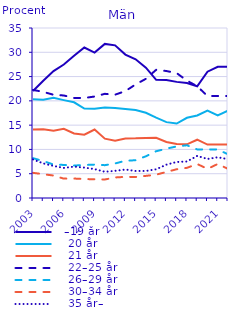
| Category |   –19 år |    20 år |    21 år |    22–25 år |    26–29 år |    30–34 år |    35 år– |
|---|---|---|---|---|---|---|---|
| 2003.0 | 22.016 | 20.329 | 14.081 | 22.251 | 8.204 | 5.182 | 7.938 |
| 2004.0 | 24.146 | 20.249 | 14.135 | 21.848 | 7.601 | 4.9 | 7.12 |
| 2005.0 | 26.123 | 20.637 | 13.871 | 21.254 | 6.89 | 4.622 | 6.603 |
| 2006.0 | 27.487 | 20.155 | 14.257 | 21.108 | 6.808 | 3.989 | 6.196 |
| 2007.0 | 29.271 | 19.701 | 13.29 | 20.589 | 6.682 | 4.005 | 6.461 |
| 2008.0 | 30.982 | 18.422 | 13.04 | 20.595 | 6.791 | 3.911 | 6.259 |
| 2009.0 | 29.947 | 18.381 | 14.103 | 20.89 | 6.876 | 3.852 | 5.952 |
| 2010.0 | 31.726 | 18.636 | 12.214 | 21.446 | 6.76 | 3.809 | 5.409 |
| 2011.0 | 31.432 | 18.554 | 11.805 | 21.276 | 7.117 | 4.227 | 5.59 |
| 2012.0 | 29.532 | 18.323 | 12.264 | 22.006 | 7.656 | 4.356 | 5.863 |
| 2013.0 | 28.554 | 18.105 | 12.283 | 23.382 | 7.781 | 4.332 | 5.564 |
| 2014.0 | 26.836 | 17.541 | 12.371 | 24.538 | 8.59 | 4.554 | 5.57 |
| 2015.0 | 24.335 | 16.529 | 12.397 | 26.387 | 9.632 | 4.806 | 5.914 |
| 2016.0 | 24.301 | 15.617 | 11.546 | 26.143 | 10.162 | 5.365 | 6.865 |
| 2017.0 | 23.908 | 15.323 | 11.11 | 25.71 | 10.616 | 5.919 | 7.414 |
| 2018.0 | 23.689 | 16.512 | 11.05 | 24.163 | 10.856 | 6.209 | 7.52 |
| 2019.0 | 23 | 17 | 12 | 23 | 10 | 7 | 8.664 |
| 2020.0 | 26 | 18 | 11 | 21 | 10 | 6 | 8.034 |
| 2021.0 | 27 | 17 | 11 | 21 | 10 | 7 | 8.388 |
| 2022.0 | 27 | 18 | 11 | 21 | 9 | 6 | 8 |